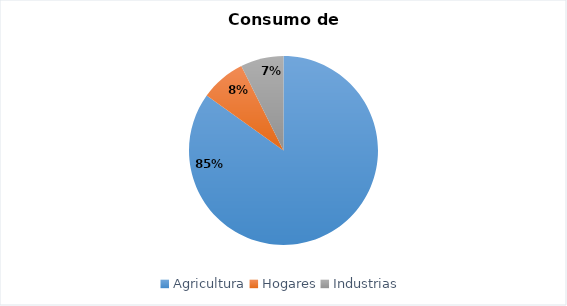
| Category | Series 1 | Series 2 | Series 3 | Series 4 | Series 0 |
|---|---|---|---|---|---|
| Agricultura | 673.352 |  |  |  |  |
| Hogares | 61.368 |  |  |  |  |
| Industrias | 58.443 |  |  |  |  |